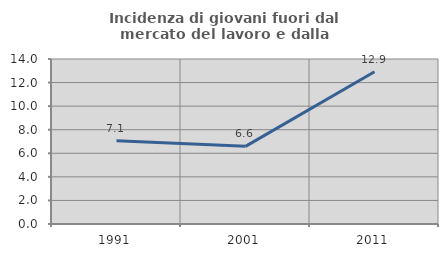
| Category | Incidenza di giovani fuori dal mercato del lavoro e dalla formazione  |
|---|---|
| 1991.0 | 7.071 |
| 2001.0 | 6.587 |
| 2011.0 | 12.917 |